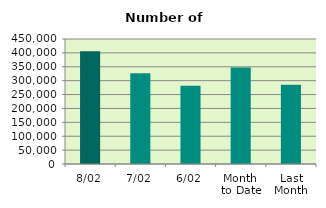
| Category | Series 0 |
|---|---|
| 8/02 | 405524 |
| 7/02 | 326806 |
| 6/02 | 281708 |
| Month 
to Date | 347619 |
| Last
Month | 285405.636 |